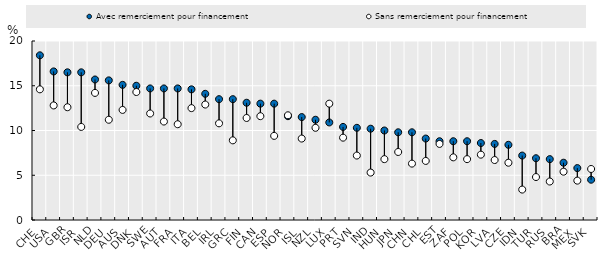
| Category | Avec remerciement pour financement | Sans remerciement pour financement |
|---|---|---|
| CHE | 18.4 | 14.6 |
| USA | 16.6 | 12.8 |
| GBR | 16.5 | 12.6 |
| ISR | 16.5 | 10.4 |
| NLD | 15.7 | 14.2 |
| DEU | 15.6 | 11.2 |
| AUS | 15.1 | 12.3 |
| DNK | 15 | 14.3 |
| SWE | 14.7 | 11.9 |
| AUT | 14.7 | 11 |
| FRA | 14.7 | 10.7 |
| ITA | 14.6 | 12.5 |
| BEL | 14.1 | 12.9 |
| IRL | 13.5 | 10.8 |
| GRC | 13.5 | 8.9 |
| FIN | 13.1 | 11.4 |
| CAN | 13 | 11.6 |
| ESP | 13 | 9.4 |
| NOR | 11.6 | 11.7 |
| ISL | 11.5 | 9.1 |
| NZL | 11.2 | 10.3 |
| LUX | 10.9 | 13 |
| PRT | 10.4 | 9.2 |
| SVN | 10.3 | 7.2 |
| IND | 10.2 | 5.3 |
| HUN | 10 | 6.8 |
| JPN | 9.8 | 7.6 |
| CHN | 9.8 | 6.3 |
| CHL | 9.1 | 6.6 |
| EST | 8.8 | 8.5 |
| ZAF | 8.8 | 7 |
| POL | 8.8 | 6.8 |
| KOR | 8.6 | 7.3 |
| LVA | 8.5 | 6.7 |
| CZE | 8.4 | 6.4 |
| IDN | 7.2 | 3.4 |
| TUR | 6.9 | 4.8 |
| RUS | 6.8 | 4.3 |
| BRA | 6.4 | 5.4 |
| MEX | 5.8 | 4.4 |
| SVK | 4.5 | 5.7 |